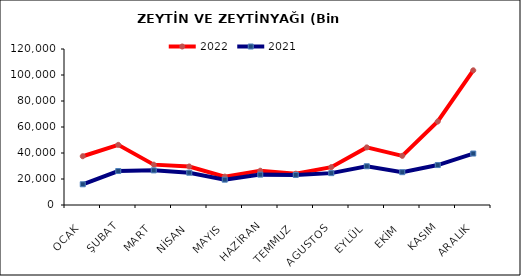
| Category | 2022 | 2021 |
|---|---|---|
| OCAK | 37521.508 | 15943.145 |
| ŞUBAT | 46265.332 | 26135.543 |
| MART | 31049.38 | 26641.717 |
| NİSAN | 29631.198 | 24837.689 |
| MAYIS | 21837.589 | 19490.091 |
| HAZİRAN | 26370.037 | 23364.857 |
| TEMMUZ | 24072.58 | 23127.54 |
| AGUSTOS | 29110.842 | 24518.567 |
| EYLÜL | 44324.274 | 29806.454 |
| EKİM | 37818.711 | 25260.424 |
| KASIM | 64223.612 | 30724.71 |
| ARALIK | 103612.998 | 39583.996 |